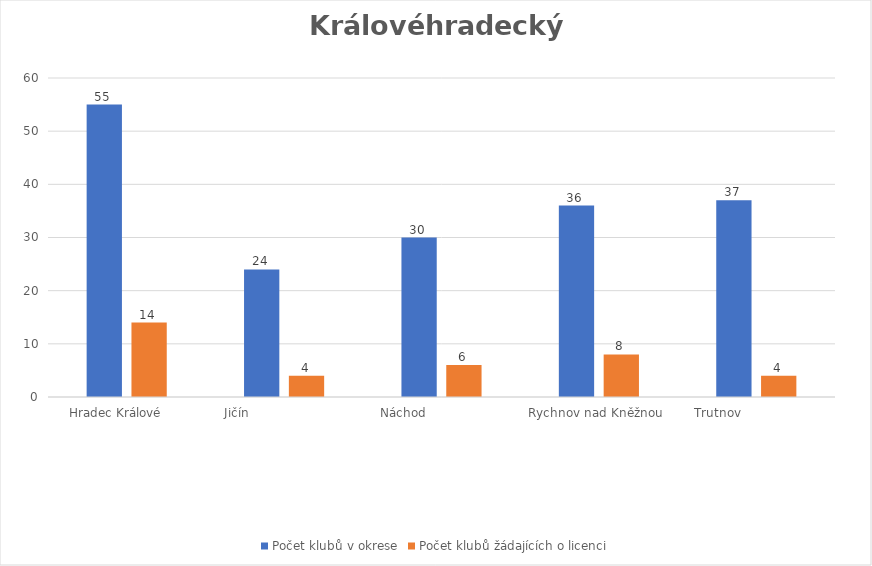
| Category | Počet klubů v okrese | Počet klubů žádajících o licenci |
|---|---|---|
| Hradec Králové      | 55 | 14 |
| Jičín                         | 24 | 4 |
| Náchod                    | 30 | 6 |
| Rychnov nad Kněžnou  | 36 | 8 |
| Trutnov                    | 37 | 4 |